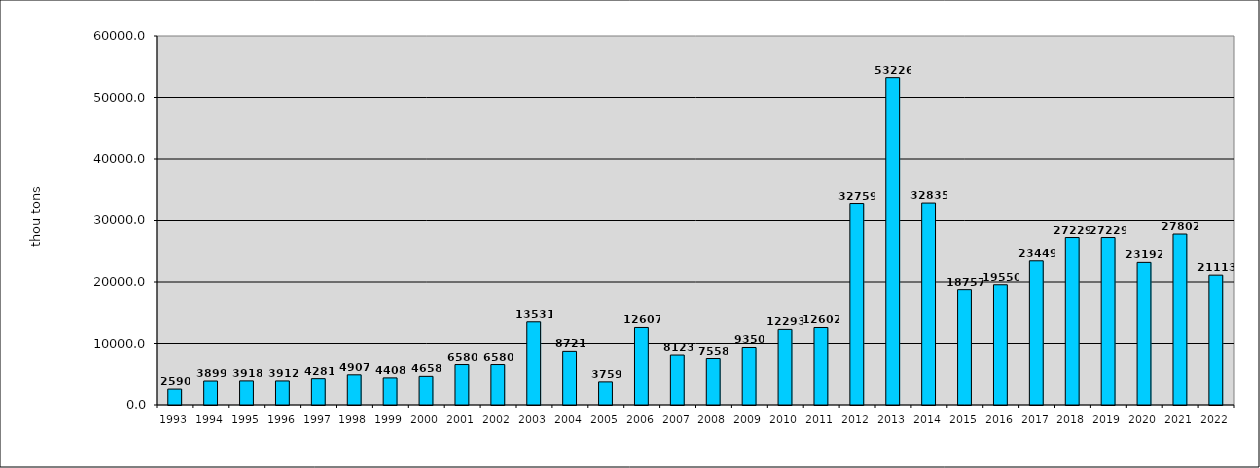
| Category | Series 0 |
|---|---|
| 1993.0 | 2590 |
| 1994.0 | 3899 |
| 1995.0 | 3918 |
| 1996.0 | 3912 |
| 1997.0 | 4281 |
| 1998.0 | 4907 |
| 1999.0 | 4408 |
| 2000.0 | 4658 |
| 2001.0 | 6580 |
| 2002.0 | 6580 |
| 2003.0 | 13531 |
| 2004.0 | 8721 |
| 2005.0 | 3759 |
| 2006.0 | 12607 |
| 2007.0 | 8123 |
| 2008.0 | 7558 |
| 2009.0 | 9350 |
| 2010.0 | 12293 |
| 2011.0 | 12602 |
| 2012.0 | 32759 |
| 2013.0 | 53226 |
| 2014.0 | 32835 |
| 2015.0 | 18757 |
| 2016.0 | 19550 |
| 2017.0 | 23449 |
| 2018.0 | 27229 |
| 2019.0 | 27229 |
| 2020.0 | 23192 |
| 2021.0 | 27802 |
| 2022.0 | 21113 |